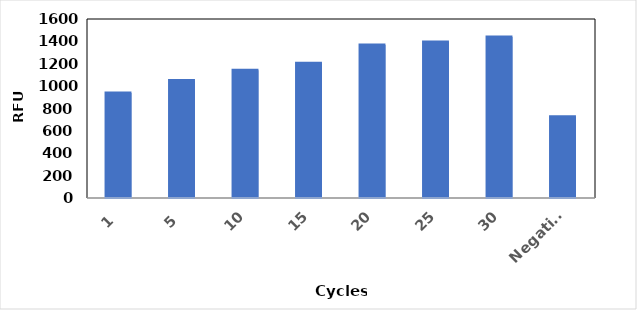
| Category | RFU |
|---|---|
| 1 | 938 |
| 5 | 1050 |
| 10 | 1142 |
| 15 | 1205 |
| 20 | 1368 |
| 25 | 1394 |
| 30 | 1440 |
| Negative | 727 |